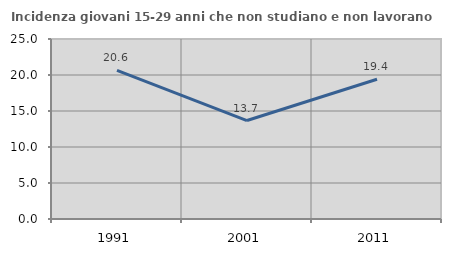
| Category | Incidenza giovani 15-29 anni che non studiano e non lavorano  |
|---|---|
| 1991.0 | 20.63 |
| 2001.0 | 13.675 |
| 2011.0 | 19.403 |